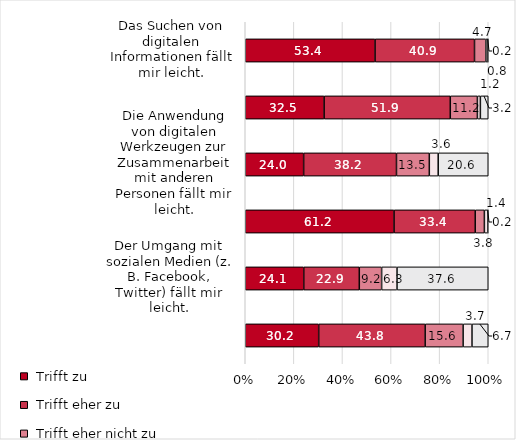
| Category | Series 0 | Series 1 | Series 2 | Series 3 | Series 4 |
|---|---|---|---|---|---|
| Das Suchen von digitalen Informationen fällt mir leicht. | 53.411 | 40.936 | 4.678 | 0.78 | 0.195 |
| Ich kann die Qualität von Quellen verschiedener digitaler Informationen einschätzen. | 32.454 | 51.927 | 11.156 | 1.217 | 3.245 |
| Die Anwendung von digitalen Werkzeugen zur Zusammenarbeit mit anderen Personen fällt mir leicht. | 24.034 | 38.197 | 13.519 | 3.648 | 20.601 |
| Ich kann mit anderen Personen angemessen digital kommunizieren (sogenannte Netiquette). | 61.233 | 33.4 | 3.777 | 1.392 | 0.199 |
| Der Umgang mit sozialen Medien (z. B. Facebook, Twitter) fällt mir leicht. | 24.082 | 22.857 | 9.184 | 6.327 | 37.551 |
| Die Visualisierung von Daten fällt mir leicht. | 30.223 | 43.813 | 15.619 | 3.651 | 6.694 |